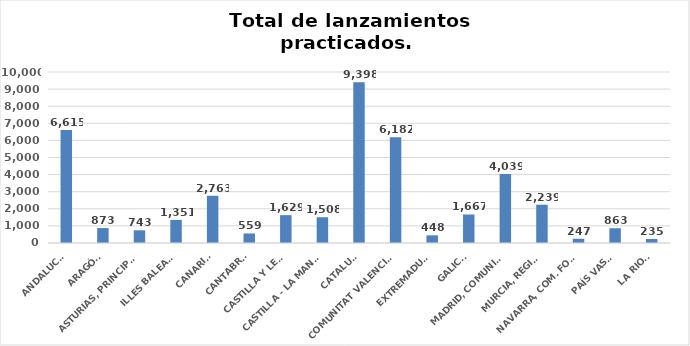
| Category | Series 0 |
|---|---|
| ANDALUCÍA | 6615 |
| ARAGÓN | 873 |
| ASTURIAS, PRINCIPADO | 743 |
| ILLES BALEARS | 1351 |
| CANARIAS | 2763 |
| CANTABRIA | 559 |
| CASTILLA Y LEÓN | 1629 |
| CASTILLA - LA MANCHA | 1508 |
| CATALUÑA | 9398 |
| COMUNITAT VALENCIANA | 6182 |
| EXTREMADURA | 448 |
| GALICIA | 1667 |
| MADRID, COMUNIDAD | 4039 |
| MURCIA, REGIÓN | 2239 |
| NAVARRA, COM. FORAL | 247 |
| PAÍS VASCO | 863 |
| LA RIOJA | 235 |